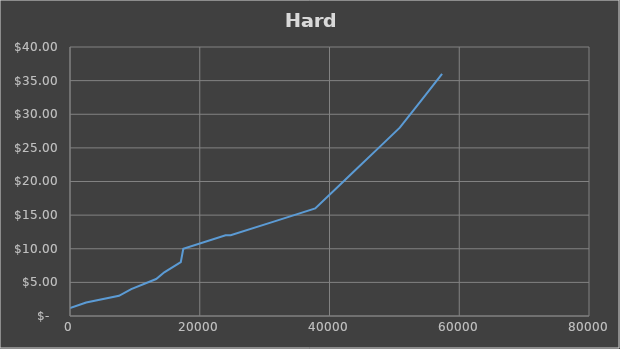
| Category | Series 0 |
|---|---|
| 0.0 | 1.2 |
| 2491.5 | 2 |
| 7550.0 | 3 |
| 9441.23 | 4 |
| 13281.0 | 5.5 |
| 14533.68 | 6.5 |
| 17077.0 | 8 |
| 17463.1 | 10 |
| 23980.649999999998 | 12 |
| 24764.55 | 12 |
| 31282.1 | 14 |
| 37799.65 | 16 |
| 41058.425 | 19 |
| 44317.200000000004 | 22 |
| 47575.975000000006 | 25 |
| 50834.75000000001 | 28 |
| 54093.52500000001 | 32 |
| 57352.30000000001 | 36 |